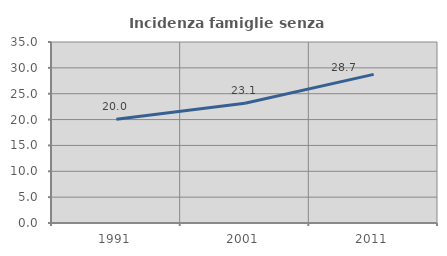
| Category | Incidenza famiglie senza nuclei |
|---|---|
| 1991.0 | 20.05 |
| 2001.0 | 23.143 |
| 2011.0 | 28.735 |